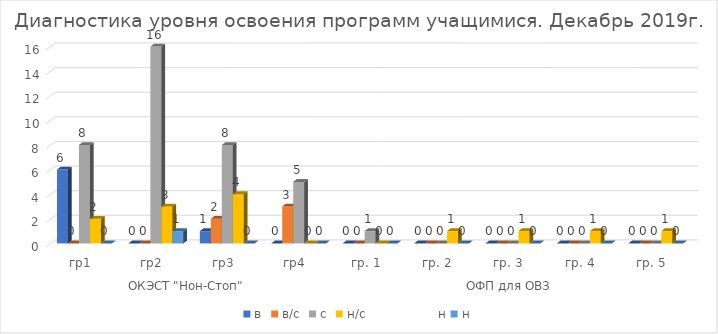
| Category | в | в/с | с | н/с                  н | н |
|---|---|---|---|---|---|
| 0 | 6 | 0 | 8 | 2 | 0 |
| 1 | 0 | 0 | 16 | 3 | 1 |
| 2 | 1 | 2 | 8 | 4 | 0 |
| 3 | 0 | 3 | 5 | 0 | 0 |
| 4 | 0 | 0 | 1 | 0 | 0 |
| 5 | 0 | 0 | 0 | 1 | 0 |
| 6 | 0 | 0 | 0 | 1 | 0 |
| 7 | 0 | 0 | 0 | 1 | 0 |
| 8 | 0 | 0 | 0 | 1 | 0 |